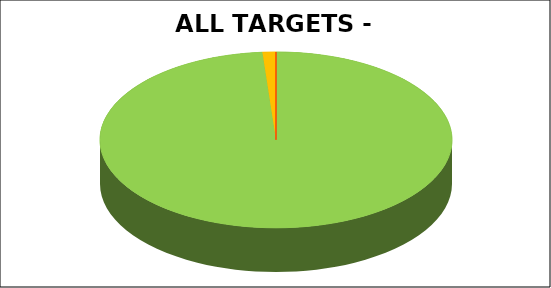
| Category | Series 0 |
|---|---|
| Green | 0.988 |
| Amber | 0.012 |
| Red | 0 |